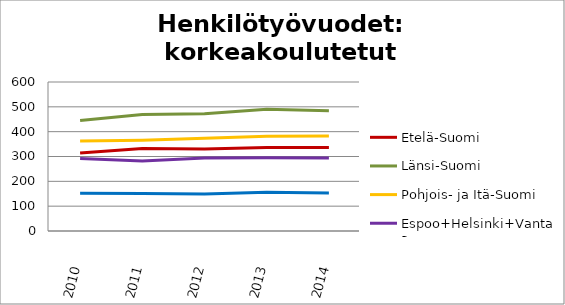
| Category | Etelä-Suomi | Länsi-Suomi | Pohjois- ja Itä-Suomi | Espoo+Helsinki+Vantaa | Muu Uusimaa |
|---|---|---|---|---|---|
| 2010.0 | 313.89 | 444.7 | 362.38 | 292.4 | 152.36 |
| 2011.0 | 332.61 | 469.55 | 365.87 | 282.1 | 151.21 |
| 2012.0 | 330.06 | 472.57 | 373.75 | 293.5 | 149.14 |
| 2013.0 | 336.49 | 490.19 | 381.43 | 294.9 | 155.92 |
| 2014.0 | 336.53 | 484.07 | 382.35 | 294.43 | 152.77 |